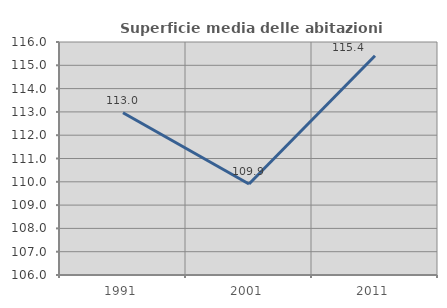
| Category | Superficie media delle abitazioni occupate |
|---|---|
| 1991.0 | 112.966 |
| 2001.0 | 109.904 |
| 2011.0 | 115.408 |